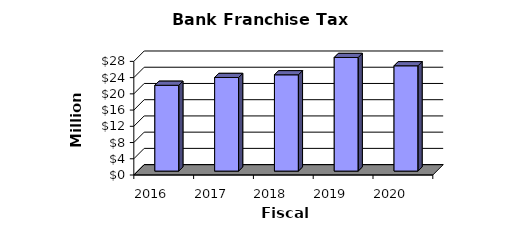
| Category | Series 0 |
|---|---|
| 2016.0 | 21142000 |
| 2017.0 | 23068000 |
| 2018.0 | 23724800 |
| 2019.0 | 29641360 |
| 2020.0 | 25949060 |